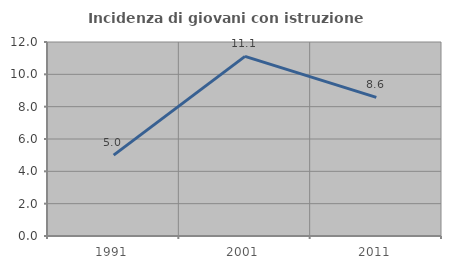
| Category | Incidenza di giovani con istruzione universitaria |
|---|---|
| 1991.0 | 5 |
| 2001.0 | 11.111 |
| 2011.0 | 8.571 |